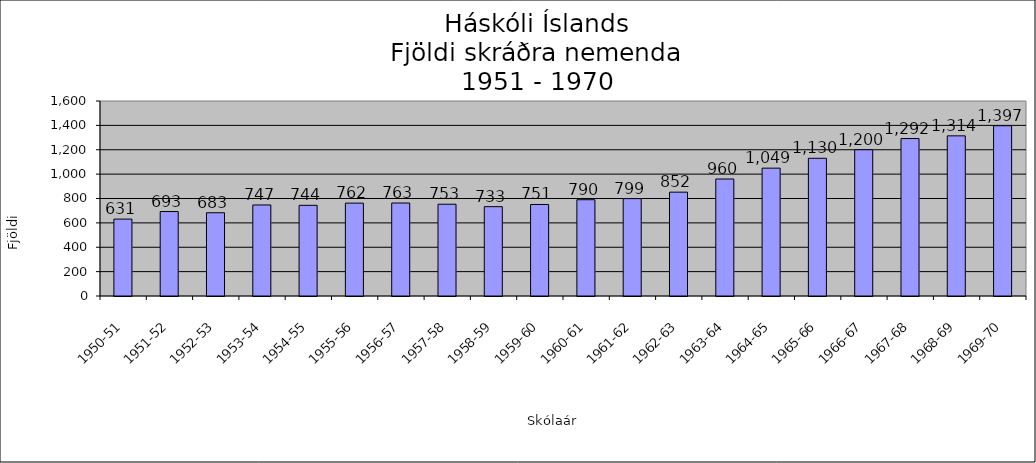
| Category | Series 0 |
|---|---|
| 1950-51 | 631 |
| 1951-52 | 693 |
| 1952-53 | 683 |
| 1953-54 | 747 |
| 1954-55 | 744 |
| 1955-56 | 762 |
| 1956-57 | 763 |
| 1957-58 | 753 |
| 1958-59 | 733 |
| 1959-60 | 751 |
| 1960-61 | 790 |
| 1961-62 | 799 |
| 1962-63 | 852 |
| 1963-64 | 960 |
| 1964-65 | 1049 |
| 1965-66 | 1130 |
| 1966-67 | 1200 |
| 1967-68 | 1292 |
| 1968-69 | 1314 |
| 1969-70 | 1397 |